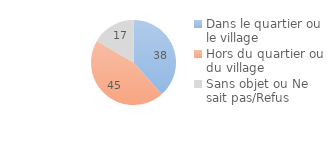
| Category | Series 0 |
|---|---|
| Dans le quartier ou le village | 38.44 |
| Hors du quartier ou du village | 45.001 |
| Sans objet ou Ne sait pas/Refus | 16.559 |